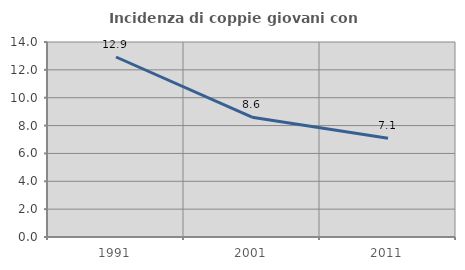
| Category | Incidenza di coppie giovani con figli |
|---|---|
| 1991.0 | 12.923 |
| 2001.0 | 8.604 |
| 2011.0 | 7.082 |